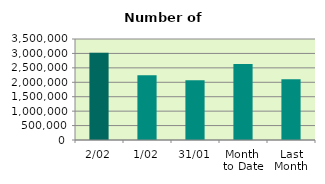
| Category | Series 0 |
|---|---|
| 2/02 | 3020086 |
| 1/02 | 2241174 |
| 31/01 | 2074332 |
| Month 
to Date | 2630630 |
| Last
Month | 2107310.455 |